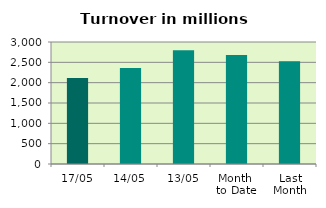
| Category | Series 0 |
|---|---|
| 17/05 | 2115.515 |
| 14/05 | 2363.342 |
| 13/05 | 2795.733 |
| Month 
to Date | 2683.029 |
| Last
Month | 2525.558 |